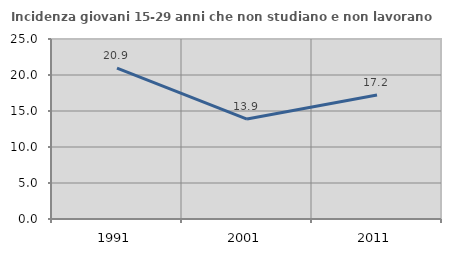
| Category | Incidenza giovani 15-29 anni che non studiano e non lavorano  |
|---|---|
| 1991.0 | 20.949 |
| 2001.0 | 13.879 |
| 2011.0 | 17.209 |